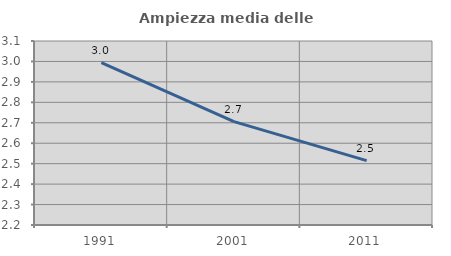
| Category | Ampiezza media delle famiglie |
|---|---|
| 1991.0 | 2.995 |
| 2001.0 | 2.706 |
| 2011.0 | 2.515 |